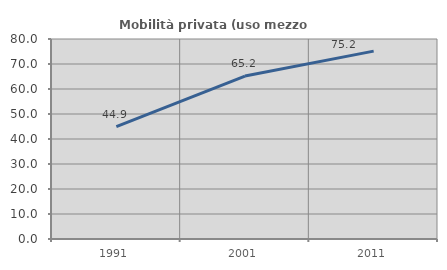
| Category | Mobilità privata (uso mezzo privato) |
|---|---|
| 1991.0 | 44.913 |
| 2001.0 | 65.164 |
| 2011.0 | 75.158 |